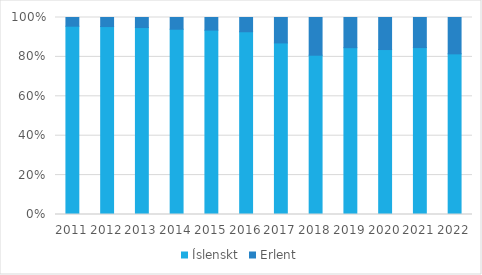
| Category | Íslenskt | Erlent |
|---|---|---|
| 2011.0 | 4102 | 190 |
| 2012.0 | 4044 | 195 |
| 2013.0 | 3996 | 215 |
| 2014.0 | 3917 | 248 |
| 2015.0 | 3927 | 269 |
| 2016.0 | 3906 | 305 |
| 2017.0 | 3799 | 563 |
| 2018.0 | 3838 | 909 |
| 2019.0 | 3805 | 688 |
| 2020.0 | 3800 | 738 |
| 2021.0 | 3736 | 673 |
| 2022.0 | 3729 | 844 |